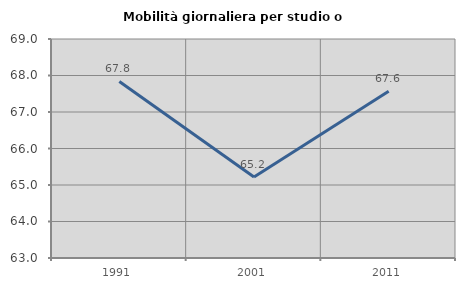
| Category | Mobilità giornaliera per studio o lavoro |
|---|---|
| 1991.0 | 67.838 |
| 2001.0 | 65.22 |
| 2011.0 | 67.569 |